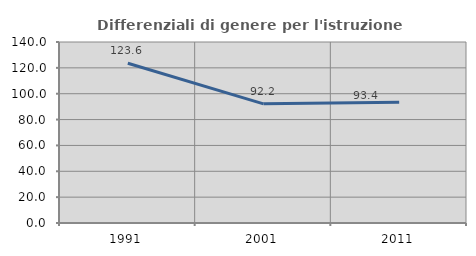
| Category | Differenziali di genere per l'istruzione superiore |
|---|---|
| 1991.0 | 123.605 |
| 2001.0 | 92.167 |
| 2011.0 | 93.442 |